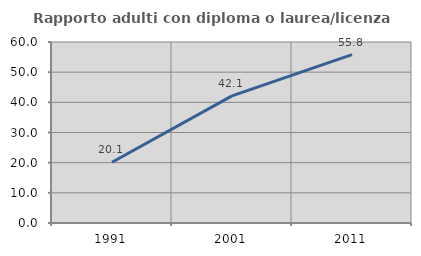
| Category | Rapporto adulti con diploma o laurea/licenza media  |
|---|---|
| 1991.0 | 20.122 |
| 2001.0 | 42.149 |
| 2011.0 | 55.797 |